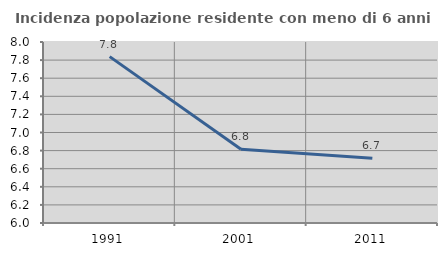
| Category | Incidenza popolazione residente con meno di 6 anni |
|---|---|
| 1991.0 | 7.838 |
| 2001.0 | 6.814 |
| 2011.0 | 6.715 |